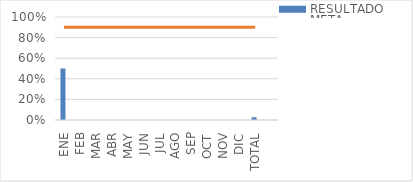
| Category | RESULTADO |
|---|---|
| ENE | 0.5 |
| FEB | 0 |
| MAR | 0 |
| ABR | 0 |
| MAY | 0 |
| JUN | 0 |
| JUL | 0 |
| AGO | 0 |
| SEP | 0 |
| OCT | 0 |
| NOV | 0 |
| DIC | 0 |
| TOTAL | 0.027 |